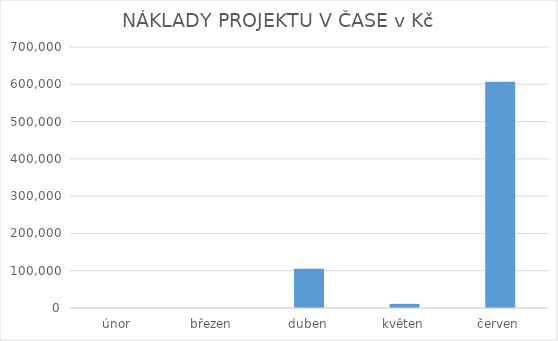
| Category | NÁKLADY CELKEM |
|---|---|
| únor | 0 |
| březen | 0 |
| duben | 105000 |
| květen | 11000 |
| červen | 607000 |